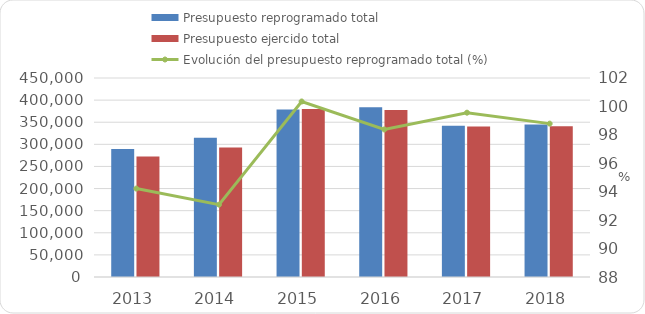
| Category | Presupuesto reprogramado total | Presupuesto ejercido total |
|---|---|---|
| 2013 | 289428.733 | 272702.822 |
| 2014 | 314864.8 | 293113.7 |
| 2015 | 378700.3 | 380021.6 |
| 2016 | 383632 | 377416.6 |
| 2017 | 341839.2 | 340334.7 |
| 2018 | 344938.7 | 340765 |